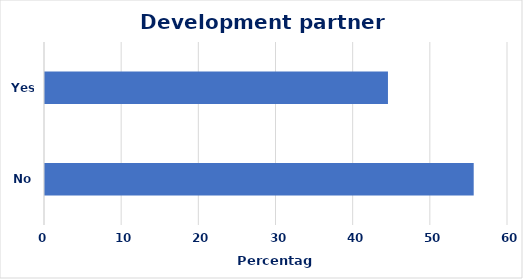
| Category | Percent |
|---|---|
| No | 55.556 |
| Yes | 44.444 |